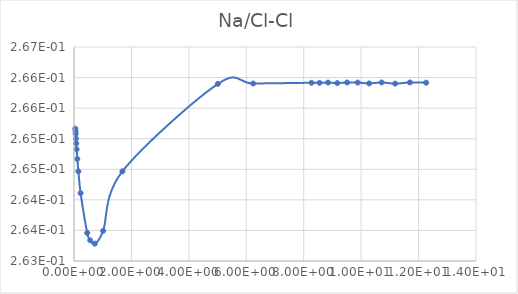
| Category | Series 0 |
|---|---|
| 0.045798 | 0.265 |
| 0.050886 | 0.265 |
| 0.057258 | 0.265 |
| 0.065456 | 0.265 |
| 0.076369 | 0.265 |
| 0.091683 | 0.265 |
| 0.11463 | 0.265 |
| 0.15298 | 0.264 |
| 0.2297 | 0.264 |
| 0.46159 | 0.263 |
| 0.56399 | 0.263 |
| 0.72477 | 0.263 |
| 1.0138 | 0.263 |
| 1.6863 | 0.264 |
| 5.0106 | 0.266 |
| 6.241 | 0.266 |
| 8.2722 | 0.266 |
| 8.5505 | 0.266 |
| 8.8482 | 0.266 |
| 9.1674 | 0.266 |
| 9.5104 | 0.266 |
| 9.8801 | 0.266 |
| 10.28 | 0.266 |
| 10.713 | 0.266 |
| 11.185 | 0.266 |
| 11.699 | 0.266 |
| 12.264 | 0.266 |